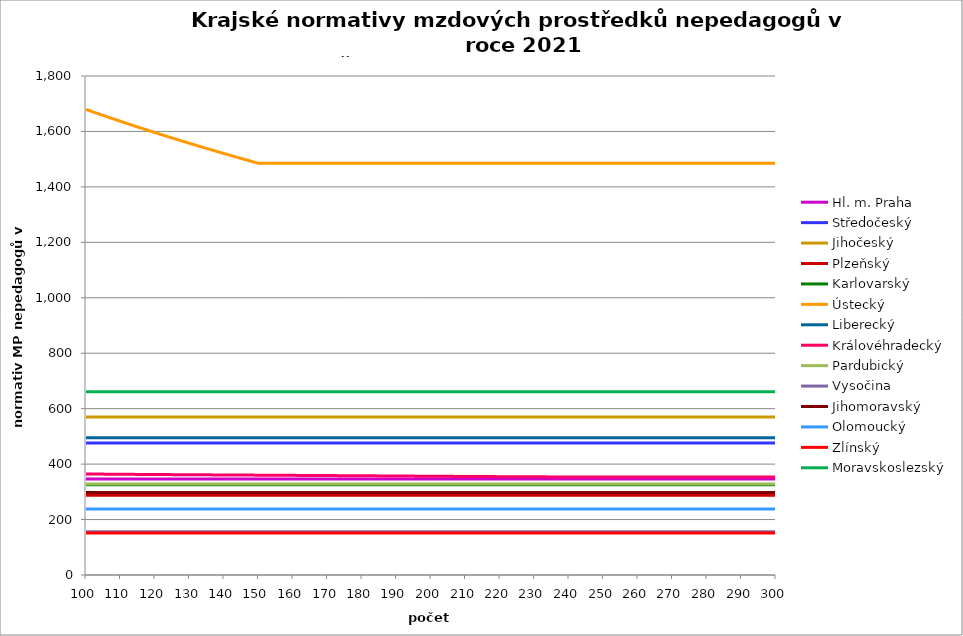
| Category | Hl. m. Praha | Středočeský | Jihočeský | Plzeňský | Karlovarský  | Ústecký   | Liberecký | Královéhradecký | Pardubický | Vysočina | Jihomoravský | Olomoucký | Zlínský | Moravskoslezský |
|---|---|---|---|---|---|---|---|---|---|---|---|---|---|---|
| 100.0 | 346.584 | 476.411 | 570.336 | 287.547 | 325.5 | 1679.367 | 495 | 364.469 | 328.432 | 156.391 | 297.28 | 238.483 | 151.2 | 660.577 |
| 101.0 | 346.58 | 476.411 | 570.336 | 287.547 | 325.5 | 1674.947 | 495 | 364.35 | 328.432 | 156.391 | 297.28 | 238.483 | 151.2 | 660.577 |
| 102.0 | 346.575 | 476.411 | 570.336 | 287.547 | 325.5 | 1670.551 | 495 | 364.236 | 328.432 | 156.391 | 297.28 | 238.483 | 151.2 | 660.577 |
| 103.0 | 346.57 | 476.411 | 570.336 | 287.547 | 325.5 | 1666.303 | 495 | 364.123 | 328.432 | 156.391 | 297.28 | 238.483 | 151.2 | 660.577 |
| 104.0 | 346.565 | 476.411 | 570.336 | 287.547 | 325.5 | 1661.952 | 495 | 364.01 | 328.432 | 156.391 | 297.28 | 238.483 | 151.2 | 660.577 |
| 105.0 | 346.56 | 476.411 | 570.336 | 287.547 | 325.5 | 1657.623 | 495 | 363.902 | 328.432 | 156.391 | 297.28 | 238.483 | 151.2 | 660.577 |
| 106.0 | 346.555 | 476.411 | 570.336 | 287.547 | 325.5 | 1653.44 | 495 | 363.789 | 328.432 | 156.391 | 297.28 | 238.483 | 151.2 | 660.577 |
| 107.0 | 346.55 | 476.411 | 570.336 | 287.547 | 325.5 | 1649.156 | 495 | 363.687 | 328.432 | 156.391 | 297.28 | 238.483 | 151.2 | 660.577 |
| 108.0 | 346.545 | 476.411 | 570.336 | 287.547 | 325.5 | 1644.894 | 495 | 363.58 | 328.432 | 156.391 | 297.28 | 238.483 | 151.2 | 660.577 |
| 109.0 | 346.54 | 476.411 | 570.336 | 287.547 | 325.5 | 1640.654 | 495 | 363.478 | 328.432 | 156.391 | 297.28 | 238.483 | 151.2 | 660.577 |
| 110.0 | 346.535 | 476.411 | 570.336 | 287.547 | 325.5 | 1636.556 | 495 | 363.382 | 328.432 | 156.391 | 297.28 | 238.483 | 151.2 | 660.577 |
| 111.0 | 346.531 | 476.411 | 570.336 | 287.547 | 325.5 | 1632.359 | 495 | 363.281 | 328.432 | 156.391 | 297.28 | 238.483 | 151.2 | 660.577 |
| 112.0 | 346.526 | 476.411 | 570.336 | 287.547 | 325.5 | 1628.183 | 495 | 363.185 | 328.432 | 156.391 | 297.28 | 238.483 | 151.2 | 660.577 |
| 113.0 | 346.521 | 476.411 | 570.336 | 287.547 | 325.5 | 1624.147 | 495 | 363.089 | 328.432 | 156.391 | 297.28 | 238.483 | 151.2 | 660.577 |
| 114.0 | 346.516 | 476.411 | 570.336 | 287.547 | 325.5 | 1620.013 | 495 | 362.999 | 328.432 | 156.391 | 297.28 | 238.483 | 151.2 | 660.577 |
| 115.0 | 346.511 | 476.411 | 570.336 | 287.547 | 325.5 | 1615.9 | 495 | 362.903 | 328.432 | 156.391 | 297.28 | 238.483 | 151.2 | 660.577 |
| 116.0 | 346.506 | 476.411 | 570.336 | 287.547 | 325.5 | 1611.925 | 495 | 362.813 | 328.432 | 156.391 | 297.28 | 238.483 | 151.2 | 660.577 |
| 117.0 | 346.501 | 476.411 | 570.336 | 287.547 | 325.5 | 1607.853 | 495 | 362.723 | 328.432 | 156.391 | 297.28 | 238.483 | 151.2 | 660.577 |
| 118.0 | 346.496 | 476.411 | 570.336 | 287.547 | 325.5 | 1603.801 | 495 | 362.633 | 328.432 | 156.391 | 297.28 | 238.483 | 151.2 | 660.577 |
| 119.0 | 346.491 | 476.411 | 570.336 | 287.547 | 325.5 | 1599.885 | 495 | 362.549 | 328.432 | 156.391 | 297.28 | 238.483 | 151.2 | 660.577 |
| 120.0 | 346.487 | 476.411 | 570.336 | 287.547 | 325.5 | 1595.874 | 495 | 362.465 | 328.432 | 156.391 | 297.28 | 238.483 | 151.2 | 660.577 |
| 121.0 | 346.482 | 476.411 | 570.336 | 287.547 | 325.5 | 1591.882 | 495 | 362.375 | 328.432 | 156.391 | 297.28 | 238.483 | 151.2 | 660.577 |
| 122.0 | 346.477 | 476.411 | 570.336 | 287.547 | 325.5 | 1587.911 | 495 | 362.291 | 328.432 | 156.391 | 297.28 | 238.483 | 151.2 | 660.577 |
| 123.0 | 346.472 | 476.411 | 570.336 | 287.547 | 325.5 | 1584.072 | 495 | 362.212 | 328.432 | 156.391 | 297.28 | 238.483 | 151.2 | 660.577 |
| 124.0 | 346.472 | 476.411 | 570.336 | 287.547 | 325.5 | 1580.139 | 495 | 362.128 | 328.432 | 156.391 | 297.28 | 238.483 | 151.2 | 660.577 |
| 125.0 | 346.467 | 476.411 | 570.336 | 287.547 | 325.5 | 1576.226 | 495 | 362.05 | 328.432 | 156.391 | 297.28 | 238.483 | 151.2 | 660.577 |
| 126.0 | 346.462 | 476.411 | 570.336 | 287.547 | 325.5 | 1572.443 | 495 | 361.966 | 328.432 | 156.391 | 297.28 | 238.483 | 151.2 | 660.577 |
| 127.0 | 346.457 | 476.411 | 570.336 | 287.547 | 325.5 | 1568.568 | 495 | 361.887 | 328.432 | 156.391 | 297.28 | 238.483 | 151.2 | 660.577 |
| 128.0 | 346.452 | 476.411 | 570.336 | 287.547 | 325.5 | 1564.712 | 495 | 361.809 | 328.432 | 156.391 | 297.28 | 238.483 | 151.2 | 660.577 |
| 129.0 | 346.447 | 476.411 | 570.336 | 287.547 | 325.5 | 1560.984 | 495 | 361.731 | 328.432 | 156.391 | 297.28 | 238.483 | 151.2 | 660.577 |
| 130.0 | 346.442 | 476.411 | 570.336 | 287.547 | 325.5 | 1557.165 | 495 | 361.652 | 328.432 | 156.391 | 297.28 | 238.483 | 151.2 | 660.577 |
| 131.0 | 346.442 | 476.411 | 570.336 | 287.547 | 325.5 | 1553.364 | 495 | 361.574 | 328.432 | 156.391 | 297.28 | 238.483 | 151.2 | 660.577 |
| 132.0 | 346.438 | 476.411 | 570.336 | 287.547 | 325.5 | 1549.583 | 495 | 361.502 | 328.432 | 156.391 | 297.28 | 238.483 | 151.2 | 660.577 |
| 133.0 | 346.433 | 476.411 | 570.336 | 287.547 | 325.5 | 1545.926 | 495 | 361.423 | 328.432 | 156.391 | 297.28 | 238.483 | 151.2 | 660.577 |
| 134.0 | 346.428 | 476.411 | 570.336 | 287.547 | 325.5 | 1542.181 | 495 | 361.351 | 328.432 | 156.391 | 297.28 | 238.483 | 151.2 | 660.577 |
| 135.0 | 346.423 | 476.411 | 570.336 | 287.547 | 325.5 | 1538.453 | 495 | 361.273 | 328.432 | 156.391 | 297.28 | 238.483 | 151.2 | 660.577 |
| 136.0 | 346.423 | 476.411 | 570.336 | 287.547 | 325.5 | 1534.849 | 495 | 361.2 | 328.432 | 156.391 | 297.28 | 238.483 | 151.2 | 660.577 |
| 137.0 | 346.418 | 476.411 | 570.336 | 287.547 | 325.5 | 1531.157 | 495 | 361.122 | 328.432 | 156.391 | 297.28 | 238.483 | 151.2 | 660.577 |
| 138.0 | 346.413 | 476.411 | 570.336 | 287.547 | 325.5 | 1527.482 | 495 | 361.05 | 328.432 | 156.391 | 297.28 | 238.483 | 151.2 | 660.577 |
| 139.0 | 346.408 | 476.411 | 570.336 | 287.547 | 325.5 | 1523.929 | 495 | 360.977 | 328.432 | 156.391 | 297.28 | 238.483 | 151.2 | 660.577 |
| 140.0 | 346.403 | 476.411 | 570.336 | 287.547 | 325.5 | 1520.289 | 495 | 360.905 | 328.432 | 156.391 | 297.28 | 238.483 | 151.2 | 660.577 |
| 141.0 | 346.403 | 476.411 | 570.336 | 287.547 | 325.5 | 1516.667 | 495 | 360.827 | 328.432 | 156.391 | 297.28 | 238.483 | 151.2 | 660.577 |
| 142.0 | 346.398 | 476.411 | 570.336 | 287.547 | 325.5 | 1513.164 | 495 | 360.755 | 328.432 | 156.391 | 297.28 | 238.483 | 151.2 | 660.577 |
| 143.0 | 346.394 | 476.411 | 570.336 | 287.547 | 325.5 | 1509.575 | 495 | 360.683 | 328.432 | 156.391 | 297.28 | 238.483 | 151.2 | 660.577 |
| 144.0 | 346.389 | 476.411 | 570.336 | 287.547 | 325.5 | 1506.003 | 495 | 360.61 | 328.432 | 156.391 | 297.28 | 238.483 | 151.2 | 660.577 |
| 145.0 | 346.389 | 476.411 | 570.336 | 287.547 | 325.5 | 1502.448 | 495 | 360.538 | 328.432 | 156.391 | 297.28 | 238.483 | 151.2 | 660.577 |
| 146.0 | 346.384 | 476.411 | 570.336 | 287.547 | 325.5 | 1499.011 | 495 | 360.466 | 328.432 | 156.391 | 297.28 | 238.483 | 151.2 | 660.577 |
| 147.0 | 346.379 | 476.411 | 570.336 | 287.547 | 325.5 | 1495.489 | 495 | 360.394 | 328.432 | 156.391 | 297.28 | 238.483 | 151.2 | 660.577 |
| 148.0 | 346.374 | 476.411 | 570.336 | 287.547 | 325.5 | 1491.983 | 495 | 360.322 | 328.432 | 156.391 | 297.28 | 238.483 | 151.2 | 660.577 |
| 149.0 | 346.374 | 476.411 | 570.336 | 287.547 | 325.5 | 1488.593 | 495 | 360.244 | 328.432 | 156.391 | 297.28 | 238.483 | 151.2 | 660.577 |
| 150.0 | 346.369 | 476.411 | 570.336 | 287.547 | 325.5 | 1485.12 | 495 | 360.172 | 328.432 | 156.391 | 297.28 | 238.483 | 151.2 | 660.577 |
| 151.0 | 346.369 | 476.411 | 570.336 | 287.547 | 325.5 | 1485.12 | 495 | 360.1 | 328.432 | 156.391 | 297.28 | 238.483 | 151.2 | 660.577 |
| 152.0 | 346.364 | 476.411 | 570.336 | 287.547 | 325.5 | 1485.12 | 495 | 360.028 | 328.432 | 156.391 | 297.28 | 238.483 | 151.2 | 660.577 |
| 153.0 | 346.364 | 476.411 | 570.336 | 287.547 | 325.5 | 1485.12 | 495 | 359.956 | 328.432 | 156.391 | 297.28 | 238.483 | 151.2 | 660.577 |
| 154.0 | 346.359 | 476.411 | 570.336 | 287.547 | 325.5 | 1485.12 | 495 | 359.884 | 328.432 | 156.391 | 297.28 | 238.483 | 151.2 | 660.577 |
| 155.0 | 346.359 | 476.411 | 570.336 | 287.547 | 325.5 | 1485.12 | 495 | 359.806 | 328.432 | 156.391 | 297.28 | 238.483 | 151.2 | 660.577 |
| 156.0 | 346.354 | 476.411 | 570.336 | 287.547 | 325.5 | 1485.12 | 495 | 359.734 | 328.432 | 156.391 | 297.28 | 238.483 | 151.2 | 660.577 |
| 157.0 | 346.354 | 476.411 | 570.336 | 287.547 | 325.5 | 1485.12 | 495 | 359.662 | 328.432 | 156.391 | 297.28 | 238.483 | 151.2 | 660.577 |
| 158.0 | 346.349 | 476.411 | 570.336 | 287.547 | 325.5 | 1485.12 | 495 | 359.585 | 328.432 | 156.391 | 297.28 | 238.483 | 151.2 | 660.577 |
| 159.0 | 346.349 | 476.411 | 570.336 | 287.547 | 325.5 | 1485.12 | 495 | 359.513 | 328.432 | 156.391 | 297.28 | 238.483 | 151.2 | 660.577 |
| 160.0 | 346.345 | 476.411 | 570.336 | 287.547 | 325.5 | 1485.12 | 495 | 359.436 | 328.432 | 156.391 | 297.28 | 238.483 | 151.2 | 660.577 |
| 161.0 | 346.345 | 476.411 | 570.336 | 287.547 | 325.5 | 1485.12 | 495 | 359.364 | 328.432 | 156.391 | 297.28 | 238.483 | 151.2 | 660.577 |
| 162.0 | 346.34 | 476.411 | 570.336 | 287.547 | 325.5 | 1485.12 | 495 | 359.287 | 328.432 | 156.391 | 297.28 | 238.483 | 151.2 | 660.577 |
| 163.0 | 346.34 | 476.411 | 570.336 | 287.547 | 325.5 | 1485.12 | 495 | 359.215 | 328.432 | 156.391 | 297.28 | 238.483 | 151.2 | 660.577 |
| 164.0 | 346.335 | 476.411 | 570.336 | 287.547 | 325.5 | 1485.12 | 495 | 359.138 | 328.432 | 156.391 | 297.28 | 238.483 | 151.2 | 660.577 |
| 165.0 | 346.335 | 476.411 | 570.336 | 287.547 | 325.5 | 1485.12 | 495 | 359.061 | 328.432 | 156.391 | 297.28 | 238.483 | 151.2 | 660.577 |
| 166.0 | 346.33 | 476.411 | 570.336 | 287.547 | 325.5 | 1485.12 | 495 | 358.989 | 328.432 | 156.391 | 297.28 | 238.483 | 151.2 | 660.577 |
| 167.0 | 346.33 | 476.411 | 570.336 | 287.547 | 325.5 | 1485.12 | 495 | 358.912 | 328.432 | 156.391 | 297.28 | 238.483 | 151.2 | 660.577 |
| 168.0 | 346.325 | 476.411 | 570.336 | 287.547 | 325.5 | 1485.12 | 495 | 358.835 | 328.432 | 156.391 | 297.28 | 238.483 | 151.2 | 660.577 |
| 169.0 | 346.325 | 476.411 | 570.336 | 287.547 | 325.5 | 1485.12 | 495 | 358.758 | 328.432 | 156.391 | 297.28 | 238.483 | 151.2 | 660.577 |
| 170.0 | 346.32 | 476.411 | 570.336 | 287.547 | 325.5 | 1485.12 | 495 | 358.681 | 328.432 | 156.391 | 297.28 | 238.483 | 151.2 | 660.577 |
| 171.0 | 346.32 | 476.411 | 570.336 | 287.547 | 325.5 | 1485.12 | 495 | 358.604 | 328.432 | 156.391 | 297.28 | 238.483 | 151.2 | 660.577 |
| 172.0 | 346.315 | 476.411 | 570.336 | 287.547 | 325.5 | 1485.12 | 495 | 358.527 | 328.432 | 156.391 | 297.28 | 238.483 | 151.2 | 660.577 |
| 173.0 | 346.315 | 476.411 | 570.336 | 287.547 | 325.5 | 1485.12 | 495 | 358.45 | 328.432 | 156.391 | 297.28 | 238.483 | 151.2 | 660.577 |
| 174.0 | 346.31 | 476.411 | 570.336 | 287.547 | 325.5 | 1485.12 | 495 | 358.368 | 328.432 | 156.391 | 297.28 | 238.483 | 151.2 | 660.577 |
| 175.0 | 346.31 | 476.411 | 570.336 | 287.547 | 325.5 | 1485.12 | 495 | 358.291 | 328.432 | 156.391 | 297.28 | 238.483 | 151.2 | 660.577 |
| 176.0 | 346.305 | 476.411 | 570.336 | 287.547 | 325.5 | 1485.12 | 495 | 358.214 | 328.432 | 156.391 | 297.28 | 238.483 | 151.2 | 660.577 |
| 177.0 | 346.305 | 476.411 | 570.336 | 287.547 | 325.5 | 1485.12 | 495 | 358.132 | 328.432 | 156.391 | 297.28 | 238.483 | 151.2 | 660.577 |
| 178.0 | 346.301 | 476.411 | 570.336 | 287.547 | 325.5 | 1485.12 | 495 | 358.055 | 328.432 | 156.391 | 297.28 | 238.483 | 151.2 | 660.577 |
| 179.0 | 346.301 | 476.411 | 570.336 | 287.547 | 325.5 | 1485.12 | 495 | 357.973 | 328.432 | 156.391 | 297.28 | 238.483 | 151.2 | 660.577 |
| 180.0 | 346.296 | 476.411 | 570.336 | 287.547 | 325.5 | 1485.12 | 495 | 357.897 | 328.432 | 156.391 | 297.28 | 238.483 | 151.2 | 660.577 |
| 181.0 | 346.296 | 476.411 | 570.336 | 287.547 | 325.5 | 1485.12 | 495 | 357.815 | 328.432 | 156.391 | 297.28 | 238.483 | 151.2 | 660.577 |
| 182.0 | 346.296 | 476.411 | 570.336 | 287.547 | 325.5 | 1485.12 | 495 | 357.738 | 328.432 | 156.391 | 297.28 | 238.483 | 151.2 | 660.577 |
| 183.0 | 346.291 | 476.411 | 570.336 | 287.547 | 325.5 | 1485.12 | 495 | 357.656 | 328.432 | 156.391 | 297.28 | 238.483 | 151.2 | 660.577 |
| 184.0 | 346.291 | 476.411 | 570.336 | 287.547 | 325.5 | 1485.12 | 495 | 357.574 | 328.432 | 156.391 | 297.28 | 238.483 | 151.2 | 660.577 |
| 185.0 | 346.286 | 476.411 | 570.336 | 287.547 | 325.5 | 1485.12 | 495 | 357.498 | 328.432 | 156.391 | 297.28 | 238.483 | 151.2 | 660.577 |
| 186.0 | 346.286 | 476.411 | 570.336 | 287.547 | 325.5 | 1485.12 | 495 | 357.416 | 328.432 | 156.391 | 297.28 | 238.483 | 151.2 | 660.577 |
| 187.0 | 346.281 | 476.411 | 570.336 | 287.547 | 325.5 | 1485.12 | 495 | 357.334 | 328.432 | 156.391 | 297.28 | 238.483 | 151.2 | 660.577 |
| 188.0 | 346.281 | 476.411 | 570.336 | 287.547 | 325.5 | 1485.12 | 495 | 357.252 | 328.432 | 156.391 | 297.28 | 238.483 | 151.2 | 660.577 |
| 189.0 | 346.276 | 476.411 | 570.336 | 287.547 | 325.5 | 1485.12 | 495 | 357.17 | 328.432 | 156.391 | 297.28 | 238.483 | 151.2 | 660.577 |
| 190.0 | 346.276 | 476.411 | 570.336 | 287.547 | 325.5 | 1485.12 | 495 | 357.094 | 328.432 | 156.391 | 297.28 | 238.483 | 151.2 | 660.577 |
| 191.0 | 346.276 | 476.411 | 570.336 | 287.547 | 325.5 | 1485.12 | 495 | 357.012 | 328.432 | 156.391 | 297.28 | 238.483 | 151.2 | 660.577 |
| 192.0 | 346.271 | 476.411 | 570.336 | 287.547 | 325.5 | 1485.12 | 495 | 356.93 | 328.432 | 156.391 | 297.28 | 238.483 | 151.2 | 660.577 |
| 193.0 | 346.271 | 476.411 | 570.336 | 287.547 | 325.5 | 1485.12 | 495 | 356.849 | 328.432 | 156.391 | 297.28 | 238.483 | 151.2 | 660.577 |
| 194.0 | 346.266 | 476.411 | 570.336 | 287.547 | 325.5 | 1485.12 | 495 | 356.767 | 328.432 | 156.391 | 297.28 | 238.483 | 151.2 | 660.577 |
| 195.0 | 346.266 | 476.411 | 570.336 | 287.547 | 325.5 | 1485.12 | 495 | 356.686 | 328.432 | 156.391 | 297.28 | 238.483 | 151.2 | 660.577 |
| 196.0 | 346.261 | 476.411 | 570.336 | 287.547 | 325.5 | 1485.12 | 495 | 356.604 | 328.432 | 156.391 | 297.28 | 238.483 | 151.2 | 660.577 |
| 197.0 | 346.261 | 476.411 | 570.336 | 287.547 | 325.5 | 1485.12 | 495 | 356.523 | 328.432 | 156.391 | 297.28 | 238.483 | 151.2 | 660.577 |
| 198.0 | 346.261 | 476.411 | 570.336 | 287.547 | 325.5 | 1485.12 | 495 | 356.441 | 328.432 | 156.391 | 297.28 | 238.483 | 151.2 | 660.577 |
| 199.0 | 346.257 | 476.411 | 570.336 | 287.547 | 325.5 | 1485.12 | 495 | 356.36 | 328.432 | 156.391 | 297.28 | 238.483 | 151.2 | 660.577 |
| 200.0 | 346.257 | 476.411 | 570.336 | 287.547 | 325.5 | 1485.12 | 495 | 356.284 | 328.432 | 156.391 | 297.28 | 238.483 | 151.2 | 660.577 |
| 201.0 | 346.252 | 476.411 | 570.336 | 287.547 | 325.5 | 1485.12 | 495 | 356.202 | 328.432 | 156.391 | 297.28 | 238.483 | 151.2 | 660.577 |
| 202.0 | 346.252 | 476.411 | 570.336 | 287.547 | 325.5 | 1485.12 | 495 | 356.121 | 328.432 | 156.391 | 297.28 | 238.483 | 151.2 | 660.577 |
| 203.0 | 346.252 | 476.411 | 570.336 | 287.547 | 325.5 | 1485.12 | 495 | 356.04 | 328.432 | 156.391 | 297.28 | 238.483 | 151.2 | 660.577 |
| 204.0 | 346.247 | 476.411 | 570.336 | 287.547 | 325.5 | 1485.12 | 495 | 355.964 | 328.432 | 156.391 | 297.28 | 238.483 | 151.2 | 660.577 |
| 205.0 | 346.247 | 476.411 | 570.336 | 287.547 | 325.5 | 1485.12 | 495 | 355.883 | 328.432 | 156.391 | 297.28 | 238.483 | 151.2 | 660.577 |
| 206.0 | 346.242 | 476.411 | 570.336 | 287.547 | 325.5 | 1485.12 | 495 | 355.807 | 328.432 | 156.391 | 297.28 | 238.483 | 151.2 | 660.577 |
| 207.0 | 346.242 | 476.411 | 570.336 | 287.547 | 325.5 | 1485.12 | 495 | 355.726 | 328.432 | 156.391 | 297.28 | 238.483 | 151.2 | 660.577 |
| 208.0 | 346.242 | 476.411 | 570.336 | 287.547 | 325.5 | 1485.12 | 495 | 355.65 | 328.432 | 156.391 | 297.28 | 238.483 | 151.2 | 660.577 |
| 209.0 | 346.237 | 476.411 | 570.336 | 287.547 | 325.5 | 1485.12 | 495 | 355.569 | 328.432 | 156.391 | 297.28 | 238.483 | 151.2 | 660.577 |
| 210.0 | 346.237 | 476.411 | 570.336 | 287.547 | 325.5 | 1485.12 | 495 | 355.493 | 328.432 | 156.391 | 297.28 | 238.483 | 151.2 | 660.577 |
| 211.0 | 346.232 | 476.411 | 570.336 | 287.547 | 325.5 | 1485.12 | 495 | 355.418 | 328.432 | 156.391 | 297.28 | 238.483 | 151.2 | 660.577 |
| 212.0 | 346.232 | 476.411 | 570.336 | 287.547 | 325.5 | 1485.12 | 495 | 355.342 | 328.432 | 156.391 | 297.28 | 238.483 | 151.2 | 660.577 |
| 213.0 | 346.232 | 476.411 | 570.336 | 287.547 | 325.5 | 1485.12 | 495 | 355.267 | 328.432 | 156.391 | 297.28 | 238.483 | 151.2 | 660.577 |
| 214.0 | 346.227 | 476.411 | 570.336 | 287.547 | 325.5 | 1485.12 | 495 | 355.191 | 328.432 | 156.391 | 297.28 | 238.483 | 151.2 | 660.577 |
| 215.0 | 346.227 | 476.411 | 570.336 | 287.547 | 325.5 | 1485.12 | 495 | 355.121 | 328.432 | 156.391 | 297.28 | 238.483 | 151.2 | 660.577 |
| 216.0 | 346.222 | 476.411 | 570.336 | 287.547 | 325.5 | 1485.12 | 495 | 355.046 | 328.432 | 156.391 | 297.28 | 238.483 | 151.2 | 660.577 |
| 217.0 | 346.222 | 476.411 | 570.336 | 287.547 | 325.5 | 1485.12 | 495 | 354.976 | 328.432 | 156.391 | 297.28 | 238.483 | 151.2 | 660.577 |
| 218.0 | 346.222 | 476.411 | 570.336 | 287.547 | 325.5 | 1485.12 | 495 | 354.906 | 328.432 | 156.391 | 297.28 | 238.483 | 151.2 | 660.577 |
| 219.0 | 346.217 | 476.411 | 570.336 | 287.547 | 325.5 | 1485.12 | 495 | 354.836 | 328.432 | 156.391 | 297.28 | 238.483 | 151.2 | 660.577 |
| 220.0 | 346.217 | 476.411 | 570.336 | 287.547 | 325.5 | 1485.12 | 495 | 354.766 | 328.432 | 156.391 | 297.28 | 238.483 | 151.2 | 660.577 |
| 221.0 | 346.217 | 476.411 | 570.336 | 287.547 | 325.5 | 1485.12 | 495 | 354.696 | 328.432 | 156.391 | 297.28 | 238.483 | 151.2 | 660.577 |
| 222.0 | 346.213 | 476.411 | 570.336 | 287.547 | 325.5 | 1485.12 | 495 | 354.631 | 328.432 | 156.391 | 297.28 | 238.483 | 151.2 | 660.577 |
| 223.0 | 346.213 | 476.411 | 570.336 | 287.547 | 325.5 | 1485.12 | 495 | 354.567 | 328.432 | 156.391 | 297.28 | 238.483 | 151.2 | 660.577 |
| 224.0 | 346.208 | 476.411 | 570.336 | 287.547 | 325.5 | 1485.12 | 495 | 354.502 | 328.432 | 156.391 | 297.28 | 238.483 | 151.2 | 660.577 |
| 225.0 | 346.208 | 476.411 | 570.336 | 287.547 | 325.5 | 1485.12 | 495 | 354.438 | 328.432 | 156.391 | 297.28 | 238.483 | 151.2 | 660.577 |
| 226.0 | 346.208 | 476.411 | 570.336 | 287.547 | 325.5 | 1485.12 | 495 | 354.374 | 328.432 | 156.391 | 297.28 | 238.483 | 151.2 | 660.577 |
| 227.0 | 346.203 | 476.411 | 570.336 | 287.547 | 325.5 | 1485.12 | 495 | 354.315 | 328.432 | 156.391 | 297.28 | 238.483 | 151.2 | 660.577 |
| 228.0 | 346.203 | 476.411 | 570.336 | 287.547 | 325.5 | 1485.12 | 495 | 354.256 | 328.432 | 156.391 | 297.28 | 238.483 | 151.2 | 660.577 |
| 229.0 | 346.203 | 476.411 | 570.336 | 287.547 | 325.5 | 1485.12 | 495 | 354.197 | 328.432 | 156.391 | 297.28 | 238.483 | 151.2 | 660.577 |
| 230.0 | 346.198 | 476.411 | 570.336 | 287.547 | 325.5 | 1485.12 | 495 | 354.143 | 328.432 | 156.391 | 297.28 | 238.483 | 151.2 | 660.577 |
| 231.0 | 346.198 | 476.411 | 570.336 | 287.547 | 325.5 | 1485.12 | 495 | 354.089 | 328.432 | 156.391 | 297.28 | 238.483 | 151.2 | 660.577 |
| 232.0 | 346.198 | 476.411 | 570.336 | 287.547 | 325.5 | 1485.12 | 495 | 354.036 | 328.432 | 156.391 | 297.28 | 238.483 | 151.2 | 660.577 |
| 233.0 | 346.193 | 476.411 | 570.336 | 287.547 | 325.5 | 1485.12 | 495 | 353.982 | 328.432 | 156.391 | 297.28 | 238.483 | 151.2 | 660.577 |
| 234.0 | 346.193 | 476.411 | 570.336 | 287.547 | 325.5 | 1485.12 | 495 | 353.934 | 328.432 | 156.391 | 297.28 | 238.483 | 151.2 | 660.577 |
| 235.0 | 346.193 | 476.411 | 570.336 | 287.547 | 325.5 | 1485.12 | 495 | 353.886 | 328.432 | 156.391 | 297.28 | 238.483 | 151.2 | 660.577 |
| 236.0 | 346.188 | 476.411 | 570.336 | 287.547 | 325.5 | 1485.12 | 495 | 353.843 | 328.432 | 156.391 | 297.28 | 238.483 | 151.2 | 660.577 |
| 237.0 | 346.188 | 476.411 | 570.336 | 287.547 | 325.5 | 1485.12 | 495 | 353.8 | 328.432 | 156.391 | 297.28 | 238.483 | 151.2 | 660.577 |
| 238.0 | 346.183 | 476.411 | 570.336 | 287.547 | 325.5 | 1485.12 | 495 | 353.758 | 328.432 | 156.391 | 297.28 | 238.483 | 151.2 | 660.577 |
| 239.0 | 346.183 | 476.411 | 570.336 | 287.547 | 325.5 | 1485.12 | 495 | 353.72 | 328.432 | 156.391 | 297.28 | 238.483 | 151.2 | 660.577 |
| 240.0 | 346.183 | 476.411 | 570.336 | 287.547 | 325.5 | 1485.12 | 495 | 353.683 | 328.432 | 156.391 | 297.28 | 238.483 | 151.2 | 660.577 |
| 241.0 | 346.178 | 476.411 | 570.336 | 287.547 | 325.5 | 1485.12 | 495 | 353.645 | 328.432 | 156.391 | 297.28 | 238.483 | 151.2 | 660.577 |
| 242.0 | 346.178 | 476.411 | 570.336 | 287.547 | 325.5 | 1485.12 | 495 | 353.613 | 328.432 | 156.391 | 297.28 | 238.483 | 151.2 | 660.577 |
| 243.0 | 346.178 | 476.411 | 570.336 | 287.547 | 325.5 | 1485.12 | 495 | 353.586 | 328.432 | 156.391 | 297.28 | 238.483 | 151.2 | 660.577 |
| 244.0 | 346.173 | 476.411 | 570.336 | 287.547 | 325.5 | 1485.12 | 495 | 353.554 | 328.432 | 156.391 | 297.28 | 238.483 | 151.2 | 660.577 |
| 245.0 | 346.173 | 476.411 | 570.336 | 287.547 | 325.5 | 1485.12 | 495 | 353.533 | 328.432 | 156.391 | 297.28 | 238.483 | 151.2 | 660.577 |
| 246.0 | 346.173 | 476.411 | 570.336 | 287.547 | 325.5 | 1485.12 | 495 | 353.512 | 328.432 | 156.391 | 297.28 | 238.483 | 151.2 | 660.577 |
| 247.0 | 346.169 | 476.411 | 570.336 | 287.547 | 325.5 | 1485.12 | 495 | 353.49 | 328.432 | 156.391 | 297.28 | 238.483 | 151.2 | 660.577 |
| 248.0 | 346.169 | 476.411 | 570.336 | 287.547 | 325.5 | 1485.12 | 495 | 353.474 | 328.432 | 156.391 | 297.28 | 238.483 | 151.2 | 660.577 |
| 249.0 | 346.169 | 476.411 | 570.336 | 287.547 | 325.5 | 1485.12 | 495 | 353.474 | 328.432 | 156.391 | 297.28 | 238.483 | 151.2 | 660.577 |
| 250.0 | 346.164 | 476.411 | 570.336 | 287.547 | 325.5 | 1485.12 | 495 | 353.474 | 328.432 | 156.391 | 297.28 | 238.483 | 151.2 | 660.577 |
| 251.0 | 346.164 | 476.411 | 570.336 | 287.547 | 325.5 | 1485.12 | 495 | 353.474 | 328.432 | 156.391 | 297.28 | 238.483 | 151.2 | 660.577 |
| 252.0 | 346.164 | 476.411 | 570.336 | 287.547 | 325.5 | 1485.12 | 495 | 353.474 | 328.432 | 156.391 | 297.28 | 238.483 | 151.2 | 660.577 |
| 253.0 | 346.159 | 476.411 | 570.336 | 287.547 | 325.5 | 1485.12 | 495 | 353.474 | 328.432 | 156.391 | 297.28 | 238.483 | 151.2 | 660.577 |
| 254.0 | 346.159 | 476.411 | 570.336 | 287.547 | 325.5 | 1485.12 | 495 | 353.474 | 328.432 | 156.391 | 297.28 | 238.483 | 151.2 | 660.577 |
| 255.0 | 346.159 | 476.411 | 570.336 | 287.547 | 325.5 | 1485.12 | 495 | 353.474 | 328.432 | 156.391 | 297.28 | 238.483 | 151.2 | 660.577 |
| 256.0 | 346.154 | 476.411 | 570.336 | 287.547 | 325.5 | 1485.12 | 495 | 353.474 | 328.432 | 156.391 | 297.28 | 238.483 | 151.2 | 660.577 |
| 257.0 | 346.154 | 476.411 | 570.336 | 287.547 | 325.5 | 1485.12 | 495 | 353.474 | 328.432 | 156.391 | 297.28 | 238.483 | 151.2 | 660.577 |
| 258.0 | 346.154 | 476.411 | 570.336 | 287.547 | 325.5 | 1485.12 | 495 | 353.474 | 328.432 | 156.391 | 297.28 | 238.483 | 151.2 | 660.577 |
| 259.0 | 346.154 | 476.411 | 570.336 | 287.547 | 325.5 | 1485.12 | 495 | 353.474 | 328.432 | 156.391 | 297.28 | 238.483 | 151.2 | 660.577 |
| 260.0 | 346.149 | 476.411 | 570.336 | 287.547 | 325.5 | 1485.12 | 495 | 353.474 | 328.432 | 156.391 | 297.28 | 238.483 | 151.2 | 660.577 |
| 261.0 | 346.149 | 476.411 | 570.336 | 287.547 | 325.5 | 1485.12 | 495 | 353.474 | 328.432 | 156.391 | 297.28 | 238.483 | 151.2 | 660.577 |
| 262.0 | 346.149 | 476.411 | 570.336 | 287.547 | 325.5 | 1485.12 | 495 | 353.474 | 328.432 | 156.391 | 297.28 | 238.483 | 151.2 | 660.577 |
| 263.0 | 346.144 | 476.411 | 570.336 | 287.547 | 325.5 | 1485.12 | 495 | 353.474 | 328.432 | 156.391 | 297.28 | 238.483 | 151.2 | 660.577 |
| 264.0 | 346.144 | 476.411 | 570.336 | 287.547 | 325.5 | 1485.12 | 495 | 353.474 | 328.432 | 156.391 | 297.28 | 238.483 | 151.2 | 660.577 |
| 265.0 | 346.144 | 476.411 | 570.336 | 287.547 | 325.5 | 1485.12 | 495 | 353.474 | 328.432 | 156.391 | 297.28 | 238.483 | 151.2 | 660.577 |
| 266.0 | 346.139 | 476.411 | 570.336 | 287.547 | 325.5 | 1485.12 | 495 | 353.474 | 328.432 | 156.391 | 297.28 | 238.483 | 151.2 | 660.577 |
| 267.0 | 346.139 | 476.411 | 570.336 | 287.547 | 325.5 | 1485.12 | 495 | 353.474 | 328.432 | 156.391 | 297.28 | 238.483 | 151.2 | 660.577 |
| 268.0 | 346.139 | 476.411 | 570.336 | 287.547 | 325.5 | 1485.12 | 495 | 353.474 | 328.432 | 156.391 | 297.28 | 238.483 | 151.2 | 660.577 |
| 269.0 | 346.134 | 476.411 | 570.336 | 287.547 | 325.5 | 1485.12 | 495 | 353.474 | 328.432 | 156.391 | 297.28 | 238.483 | 151.2 | 660.577 |
| 270.0 | 346.134 | 476.411 | 570.336 | 287.547 | 325.5 | 1485.12 | 495 | 353.474 | 328.432 | 156.391 | 297.28 | 238.483 | 151.2 | 660.577 |
| 271.0 | 346.134 | 476.411 | 570.336 | 287.547 | 325.5 | 1485.12 | 495 | 353.474 | 328.432 | 156.391 | 297.28 | 238.483 | 151.2 | 660.577 |
| 272.0 | 346.129 | 476.411 | 570.336 | 287.547 | 325.5 | 1485.12 | 495 | 353.474 | 328.432 | 156.391 | 297.28 | 238.483 | 151.2 | 660.577 |
| 273.0 | 346.129 | 476.411 | 570.336 | 287.547 | 325.5 | 1485.12 | 495 | 353.474 | 328.432 | 156.391 | 297.28 | 238.483 | 151.2 | 660.577 |
| 274.0 | 346.129 | 476.411 | 570.336 | 287.547 | 325.5 | 1485.12 | 495 | 353.474 | 328.432 | 156.391 | 297.28 | 238.483 | 151.2 | 660.577 |
| 275.0 | 346.129 | 476.411 | 570.336 | 287.547 | 325.5 | 1485.12 | 495 | 353.474 | 328.432 | 156.391 | 297.28 | 238.483 | 151.2 | 660.577 |
| 276.0 | 346.125 | 476.411 | 570.336 | 287.547 | 325.5 | 1485.12 | 495 | 353.474 | 328.432 | 156.391 | 297.28 | 238.483 | 151.2 | 660.577 |
| 277.0 | 346.125 | 476.411 | 570.336 | 287.547 | 325.5 | 1485.12 | 495 | 353.474 | 328.432 | 156.391 | 297.28 | 238.483 | 151.2 | 660.577 |
| 278.0 | 346.125 | 476.411 | 570.336 | 287.547 | 325.5 | 1485.12 | 495 | 353.474 | 328.432 | 156.391 | 297.28 | 238.483 | 151.2 | 660.577 |
| 279.0 | 346.12 | 476.411 | 570.336 | 287.547 | 325.5 | 1485.12 | 495 | 353.474 | 328.432 | 156.391 | 297.28 | 238.483 | 151.2 | 660.577 |
| 280.0 | 346.12 | 476.411 | 570.336 | 287.547 | 325.5 | 1485.12 | 495 | 353.474 | 328.432 | 156.391 | 297.28 | 238.483 | 151.2 | 660.577 |
| 281.0 | 346.12 | 476.411 | 570.336 | 287.547 | 325.5 | 1485.12 | 495 | 353.474 | 328.432 | 156.391 | 297.28 | 238.483 | 151.2 | 660.577 |
| 282.0 | 346.12 | 476.411 | 570.336 | 287.547 | 325.5 | 1485.12 | 495 | 353.474 | 328.432 | 156.391 | 297.28 | 238.483 | 151.2 | 660.577 |
| 283.0 | 346.115 | 476.411 | 570.336 | 287.547 | 325.5 | 1485.12 | 495 | 353.474 | 328.432 | 156.391 | 297.28 | 238.483 | 151.2 | 660.577 |
| 284.0 | 346.115 | 476.411 | 570.336 | 287.547 | 325.5 | 1485.12 | 495 | 353.474 | 328.432 | 156.391 | 297.28 | 238.483 | 151.2 | 660.577 |
| 285.0 | 346.115 | 476.411 | 570.336 | 287.547 | 325.5 | 1485.12 | 495 | 353.474 | 328.432 | 156.391 | 297.28 | 238.483 | 151.2 | 660.577 |
| 286.0 | 346.11 | 476.411 | 570.336 | 287.547 | 325.5 | 1485.12 | 495 | 353.474 | 328.432 | 156.391 | 297.28 | 238.483 | 151.2 | 660.577 |
| 287.0 | 346.11 | 476.411 | 570.336 | 287.547 | 325.5 | 1485.12 | 495 | 353.474 | 328.432 | 156.391 | 297.28 | 238.483 | 151.2 | 660.577 |
| 288.0 | 346.11 | 476.411 | 570.336 | 287.547 | 325.5 | 1485.12 | 495 | 353.474 | 328.432 | 156.391 | 297.28 | 238.483 | 151.2 | 660.577 |
| 289.0 | 346.105 | 476.411 | 570.336 | 287.547 | 325.5 | 1485.12 | 495 | 353.474 | 328.432 | 156.391 | 297.28 | 238.483 | 151.2 | 660.577 |
| 290.0 | 346.105 | 476.411 | 570.336 | 287.547 | 325.5 | 1485.12 | 495 | 353.474 | 328.432 | 156.391 | 297.28 | 238.483 | 151.2 | 660.577 |
| 291.0 | 346.105 | 476.411 | 570.336 | 287.547 | 325.5 | 1485.12 | 495 | 353.474 | 328.432 | 156.391 | 297.28 | 238.483 | 151.2 | 660.577 |
| 292.0 | 346.105 | 476.411 | 570.336 | 287.547 | 325.5 | 1485.12 | 495 | 353.474 | 328.432 | 156.391 | 297.28 | 238.483 | 151.2 | 660.577 |
| 293.0 | 346.1 | 476.411 | 570.336 | 287.547 | 325.5 | 1485.12 | 495 | 353.474 | 328.432 | 156.391 | 297.28 | 238.483 | 151.2 | 660.577 |
| 294.0 | 346.1 | 476.411 | 570.336 | 287.547 | 325.5 | 1485.12 | 495 | 353.474 | 328.432 | 156.391 | 297.28 | 238.483 | 151.2 | 660.577 |
| 295.0 | 346.1 | 476.411 | 570.336 | 287.547 | 325.5 | 1485.12 | 495 | 353.474 | 328.432 | 156.391 | 297.28 | 238.483 | 151.2 | 660.577 |
| 296.0 | 346.1 | 476.411 | 570.336 | 287.547 | 325.5 | 1485.12 | 495 | 353.474 | 328.432 | 156.391 | 297.28 | 238.483 | 151.2 | 660.577 |
| 297.0 | 346.095 | 476.411 | 570.336 | 287.547 | 325.5 | 1485.12 | 495 | 353.474 | 328.432 | 156.391 | 297.28 | 238.483 | 151.2 | 660.577 |
| 298.0 | 346.095 | 476.411 | 570.336 | 287.547 | 325.5 | 1485.12 | 495 | 353.474 | 328.432 | 156.391 | 297.28 | 238.483 | 151.2 | 660.577 |
| 299.0 | 346.095 | 476.411 | 570.336 | 287.547 | 325.5 | 1485.12 | 495 | 353.474 | 328.432 | 156.391 | 297.28 | 238.483 | 151.2 | 660.577 |
| 300.0 | 346.09 | 476.411 | 570.336 | 287.547 | 325.5 | 1485.12 | 495 | 353.474 | 328.432 | 156.391 | 297.28 | 238.483 | 151.2 | 660.577 |